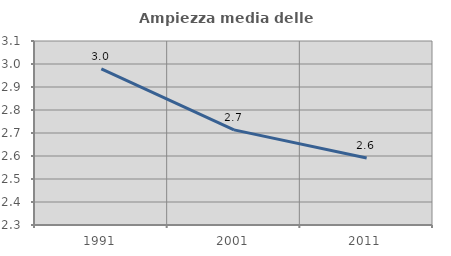
| Category | Ampiezza media delle famiglie |
|---|---|
| 1991.0 | 2.978 |
| 2001.0 | 2.714 |
| 2011.0 | 2.591 |